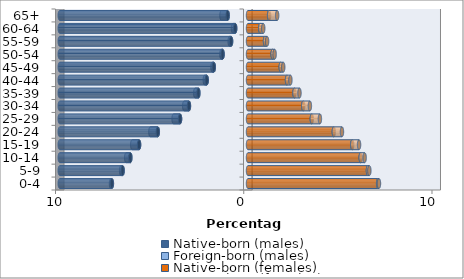
| Category | Native-born (males) | Foreign-born (males) | Native-born (females) | Foreign-born (females) |
|---|---|---|---|---|
| 0-4 | -7.231 | -0.047 | 6.913 | 0.045 |
| 5-9 | -6.661 | -0.079 | 6.371 | 0.076 |
| 10-14 | -6.251 | -0.22 | 5.985 | 0.212 |
| 15-19 | -5.786 | -0.363 | 5.537 | 0.362 |
| 20-24 | -4.791 | -0.396 | 4.559 | 0.433 |
| 25-29 | -3.609 | -0.345 | 3.391 | 0.429 |
| 30-34 | -3.137 | -0.252 | 2.932 | 0.356 |
| 35-39 | -2.636 | -0.168 | 2.468 | 0.266 |
| 40-44 | -2.192 | -0.102 | 2.072 | 0.181 |
| 45-49 | -1.817 | -0.074 | 1.739 | 0.134 |
| 50-54 | -1.35 | -0.063 | 1.309 | 0.106 |
| 55-59 | -0.899 | -0.075 | 0.904 | 0.109 |
| 60-64 | -0.68 | -0.117 | 0.649 | 0.161 |
| 65+ | -1.08 | -0.33 | 1.121 | 0.428 |